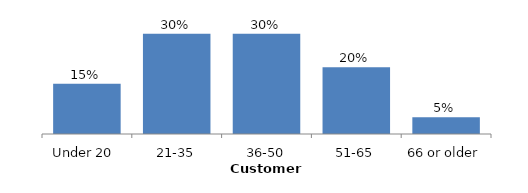
| Category | Series 0 |
|---|---|
| Under 20  | 0.15 |
| 21-35 | 0.3 |
| 36-50 | 0.3 |
| 51-65 | 0.2 |
| 66 or older | 0.05 |